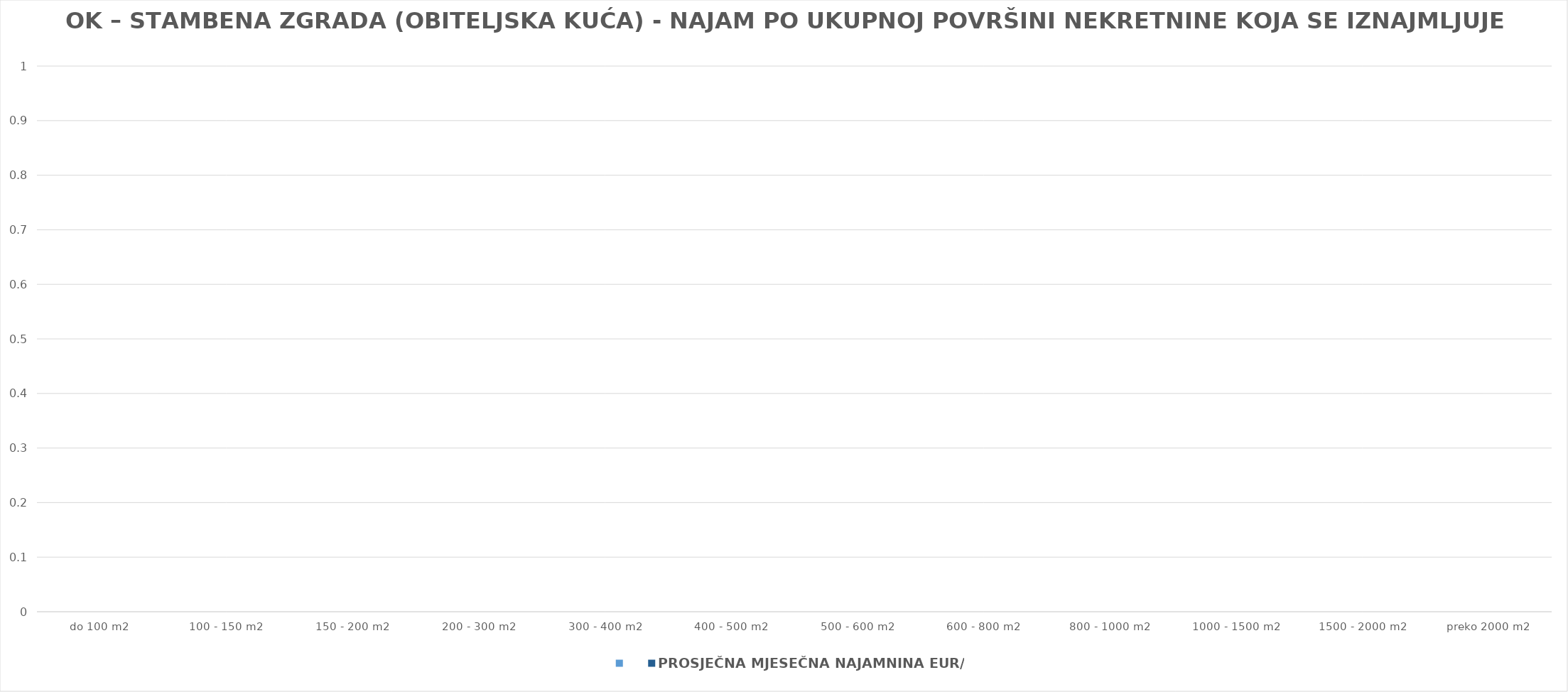
| Category | Series 0 | PROSJEČNA MJESEČNA NAJAMNINA EUR/m2 |
|---|---|---|
| do 100 m2 |  | 0 |
| 100 - 150 m2 |  | 0 |
| 150 - 200 m2 |  | 0 |
| 200 - 300 m2 |  | 0 |
| 300 - 400 m2 |  | 0 |
| 400 - 500 m2 |  | 0 |
| 500 - 600 m2 |  | 0 |
| 600 - 800 m2 |  | 0 |
| 800 - 1000 m2 |  | 0 |
| 1000 - 1500 m2 |  | 0 |
| 1500 - 2000 m2 |  | 0 |
| preko 2000 m2 |  | 0 |